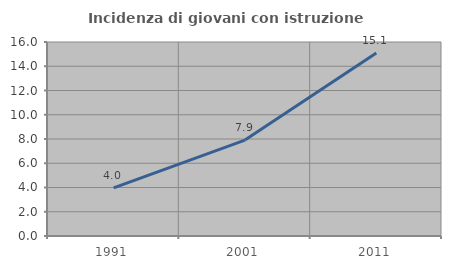
| Category | Incidenza di giovani con istruzione universitaria |
|---|---|
| 1991.0 | 3.971 |
| 2001.0 | 7.908 |
| 2011.0 | 15.1 |